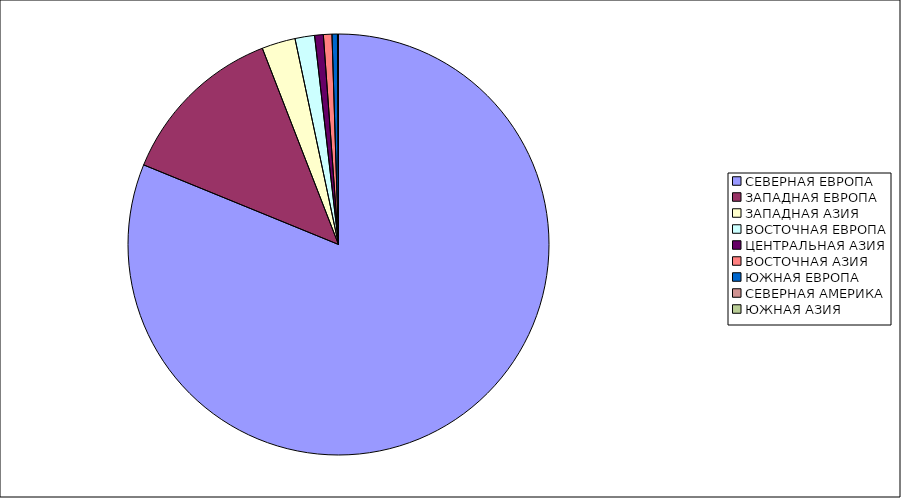
| Category | Оборот |
|---|---|
| СЕВЕРНАЯ ЕВРОПА | 81.173 |
| ЗАПАДНАЯ ЕВРОПА | 12.932 |
| ЗАПАДНАЯ АЗИЯ | 2.579 |
| ВОСТОЧНАЯ ЕВРОПА | 1.498 |
| ЦЕНТРАЛЬНАЯ АЗИЯ | 0.669 |
| ВОСТОЧНАЯ АЗИЯ | 0.654 |
| ЮЖНАЯ ЕВРОПА | 0.415 |
| СЕВЕРНАЯ АМЕРИКА | 0.078 |
| ЮЖНАЯ АЗИЯ | 0.001 |